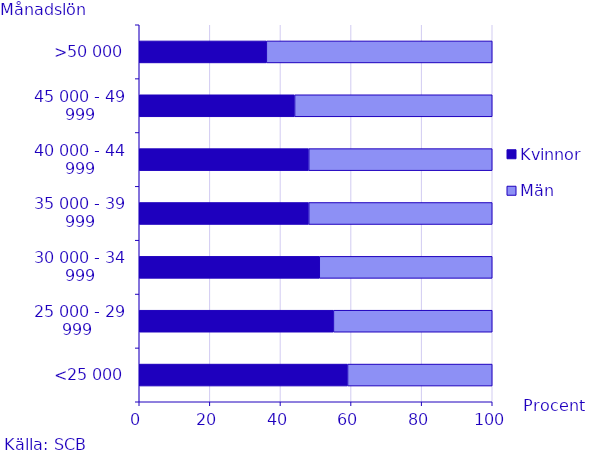
| Category | Kvinnor | Män |
|---|---|---|
| <25 000 | 59 | 41 |
| 25 000 - 29 999  | 55 | 45 |
| 30 000 - 34 999 | 51 | 49 |
| 35 000 - 39 999 | 48 | 52 |
| 40 000 - 44 999 | 48 | 52 |
| 45 000 - 49 999 | 44 | 56 |
| >50 000 | 36 | 64 |